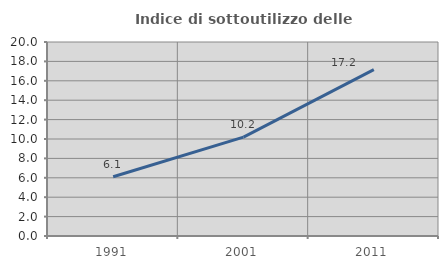
| Category | Indice di sottoutilizzo delle abitazioni  |
|---|---|
| 1991.0 | 6.106 |
| 2001.0 | 10.197 |
| 2011.0 | 17.153 |